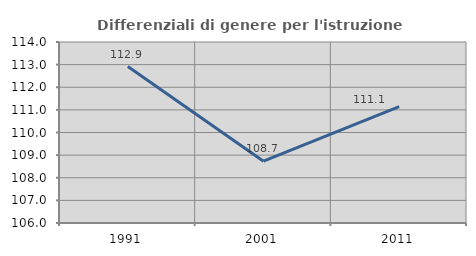
| Category | Differenziali di genere per l'istruzione superiore |
|---|---|
| 1991.0 | 112.913 |
| 2001.0 | 108.731 |
| 2011.0 | 111.148 |